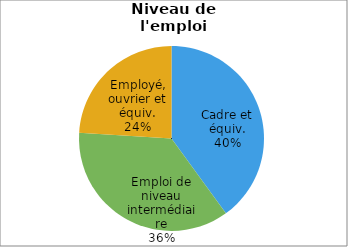
| Category | Promotion 2008 |
|---|---|
| Cadre et équiv. | 0.4 |
| Emploi de niveau intermédiaire | 0.36 |
| Employé, ouvrier et équiv. | 0.24 |